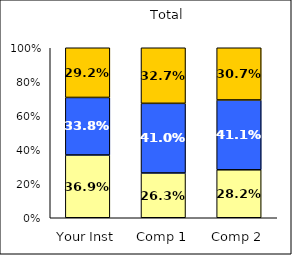
| Category | Low Civic Minded Practice | Average Civic Minded Practice | High Civic Minded Practice |
|---|---|---|---|
| Your Inst | 0.369 | 0.338 | 0.292 |
| Comp 1 | 0.263 | 0.41 | 0.327 |
| Comp 2 | 0.282 | 0.411 | 0.307 |